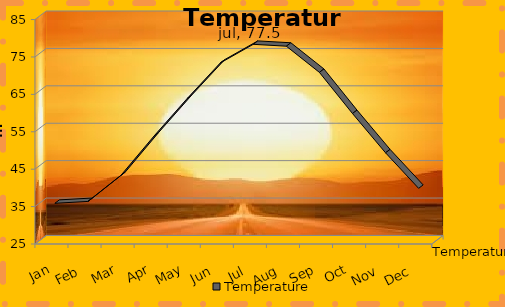
| Category | Temperature |
|---|---|
| Jan | 35 |
| Feb | 35.5 |
| Mar | 42.5 |
| Apr | 53 |
| May | 63 |
| Jun | 72.5 |
| Jul | 77.5 |
| Aug | 77 |
| Sep | 70 |
| Oct | 59 |
| Nov | 48.5 |
| Dec | 39 |